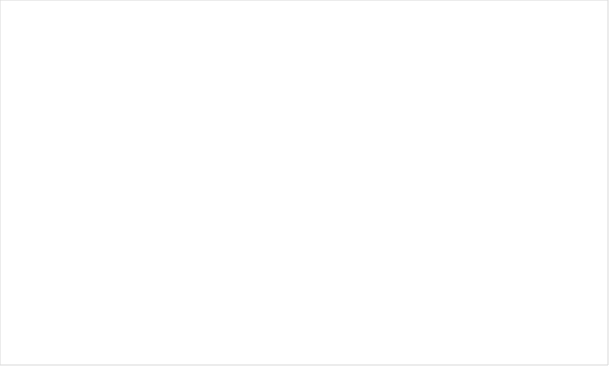
| Category | Ingen brist | Föreläggande | Anmärkning |
|---|---|---|---|
| Enskild en enhet | 0.86 | 0.124 | 0.017 |
| Enskild flera enhet | 0.889 | 0.103 | 0.009 |